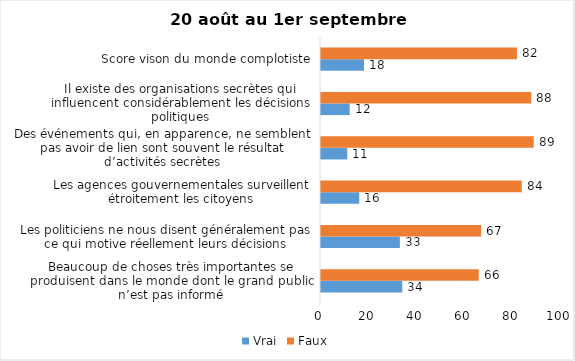
| Category | Vrai | Faux |
|---|---|---|
| Beaucoup de choses très importantes se produisent dans le monde dont le grand public n’est pas informé | 34 | 66 |
| Les politiciens ne nous disent généralement pas ce qui motive réellement leurs décisions | 33 | 67 |
| Les agences gouvernementales surveillent étroitement les citoyens | 16 | 84 |
| Des événements qui, en apparence, ne semblent pas avoir de lien sont souvent le résultat d’activités secrètes | 11 | 89 |
| Il existe des organisations secrètes qui influencent considérablement les décisions politiques | 12 | 88 |
| Score vison du monde complotiste | 18 | 82 |